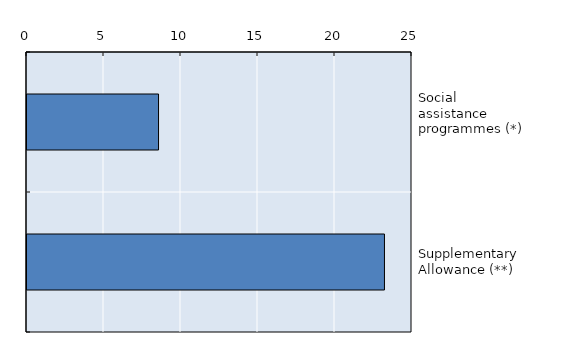
| Category | Series 0 |
|---|---|
| Social assistance programmes (*) | 8542 |
| Supplementary Allowance (**) | 23212 |